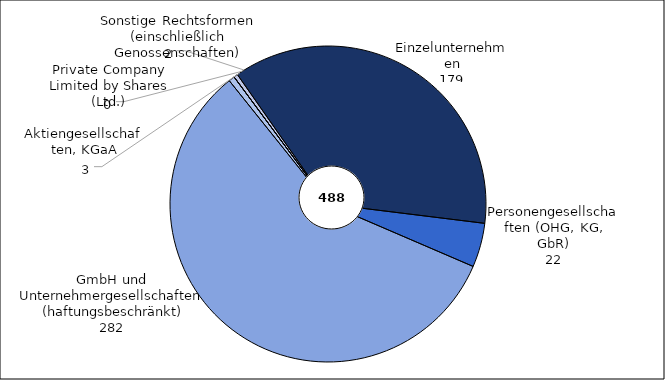
| Category | Series 0 |
|---|---|
| Einzelunternehmen | 179 |
| Personengesellschaften (OHG, KG, GbR) | 22 |
| Gesellschaften m.b.H. (einschließlich Unternehmergesellschaften (haftungsbeschränkt)) | 282 |
| Aktiengesellschaften, KGaA | 3 |
| Private Company Limited by Shares (Ltd.) | 0 |
| Sonstige Rechtsformen (einschließlich Genossenschaften) | 2 |